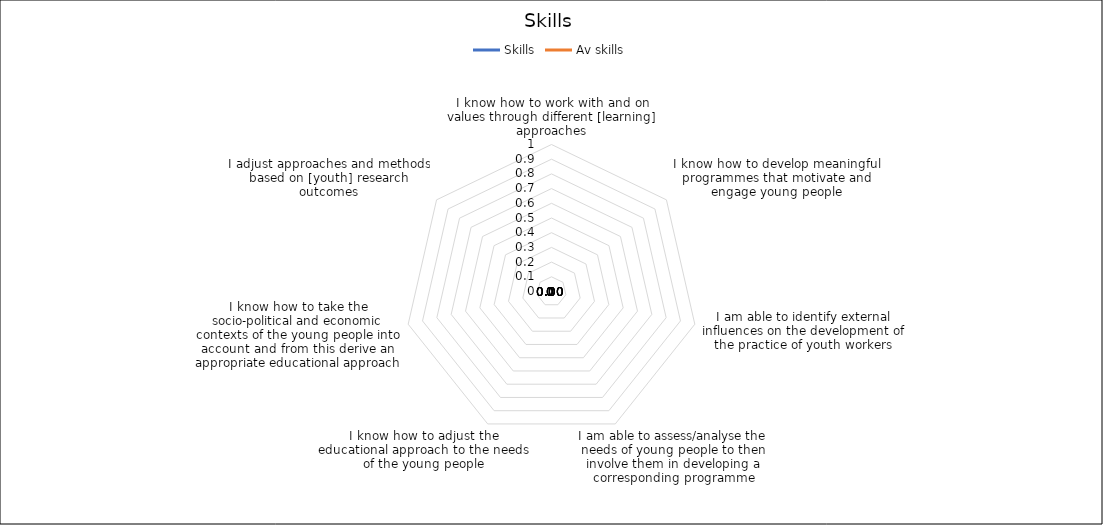
| Category | Skills | Av skills |
|---|---|---|
| I know how to work with and on values through different [learning] approaches | 0 | 0 |
| I know how to develop meaningful programmes that motivate and engage young people | 0 | 0 |
| I am able to identify external influences on the development of the practice of youth workers | 0 | 0 |
| I am able to assess/analyse the needs of young people to then involve them in developing a corresponding programme | 0 | 0 |
| I know how to adjust the educational approach to the needs of the young people | 0 | 0 |
| I know how to take the socio-political and economic contexts of the young people into account and from this derive an appropriate educational approach | 0 | 0 |
| I adjust approaches and methods based on [youth] research outcomes | 0 | 0 |